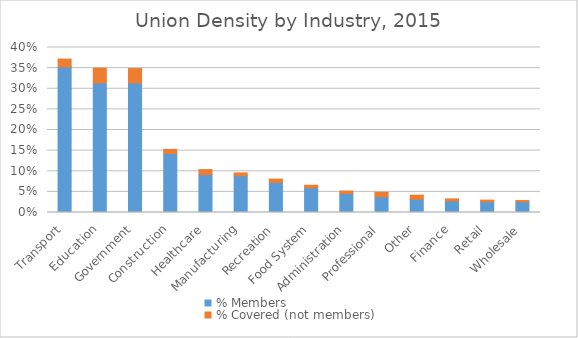
| Category | % Members | % Covered (not members) |
|---|---|---|
| Transport | 0.353 | 0.019 |
| Education | 0.314 | 0.036 |
| Government | 0.314 | 0.035 |
| Construction | 0.143 | 0.01 |
| Healthcare | 0.092 | 0.012 |
| Manufacturing | 0.089 | 0.007 |
| Recreation | 0.073 | 0.008 |
| Food System | 0.06 | 0.006 |
| Administration | 0.046 | 0.006 |
| Professional | 0.038 | 0.011 |
| Other | 0.032 | 0.01 |
| Finance | 0.028 | 0.005 |
| Retail | 0.026 | 0.004 |
| Wholesale | 0.026 | 0.003 |